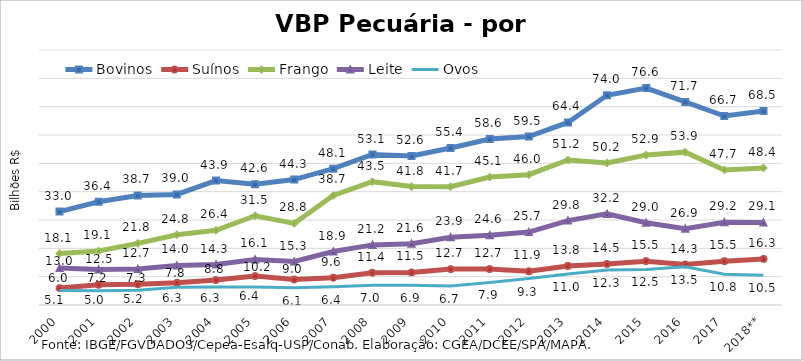
| Category | Bovinos | Suínos | Frango | Leite | Ovos |
|---|---|---|---|---|---|
| 2000 | 32.97 | 5.97 | 18.142 | 13.023 | 5.092 |
| 2001 | 36.445 | 7.162 | 19.068 | 12.531 | 5.018 |
| 2002 | 38.675 | 7.34 | 21.766 | 12.689 | 5.169 |
| 2003 | 39.033 | 7.845 | 24.815 | 13.973 | 6.253 |
| 2004 | 43.917 | 8.82 | 26.35 | 14.282 | 6.338 |
| 2005 | 42.637 | 10.226 | 31.503 | 16.063 | 6.381 |
| 2006 | 44.268 | 8.995 | 28.78 | 15.343 | 6.061 |
| 2007 | 48.109 | 9.619 | 38.668 | 18.861 | 6.442 |
| 2008 | 53.118 | 11.39 | 43.528 | 21.218 | 6.957 |
| 2009 | 52.563 | 11.513 | 41.793 | 21.632 | 6.937 |
| 2010 | 55.418 | 12.666 | 41.742 | 23.89 | 6.746 |
| 2011 | 58.585 | 12.686 | 45.146 | 24.627 | 7.95 |
| 2012 | 59.458 | 11.911 | 45.989 | 25.735 | 9.319 |
| 2013 | 64.432 | 13.791 | 51.186 | 29.78 | 10.96 |
| 2014 | 74.021 | 14.485 | 50.151 | 32.158 | 12.314 |
| 2015 | 76.568 | 15.48 | 52.944 | 29.028 | 12.538 |
| 2016 | 71.671 | 14.286 | 53.946 | 26.935 | 13.517 |
| 2017 | 66.693 | 15.475 | 47.681 | 29.234 | 10.85 |
| 2018** | 68.503 | 16.264 | 48.371 | 29.119 | 10.475 |